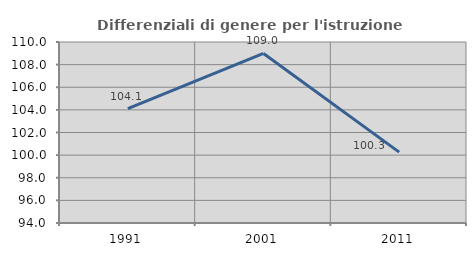
| Category | Differenziali di genere per l'istruzione superiore |
|---|---|
| 1991.0 | 104.113 |
| 2001.0 | 108.991 |
| 2011.0 | 100.262 |